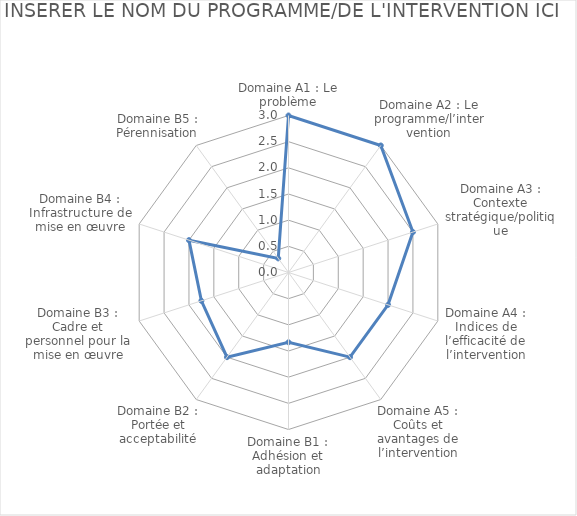
| Category | Note |
|---|---|
| Domaine A1 : Le problème | 3 |
| Domaine A2 : Le programme/l’intervention | 3 |
| Domaine A3 : Contexte stratégique/politique | 2.5 |
| Domaine A4 : Indices de l’efficacité de l’intervention | 2 |
| Domaine A5 : Coûts et avantages de l’intervention | 2 |
| Domaine B1 : Adhésion et adaptation | 1.333 |
| Domaine B2 : Portée et acceptabilité | 2 |
| Domaine B3 : Cadre et personnel pour la mise en œuvre | 1.75 |
| Domaine B4 : Infrastructure de mise en œuvre | 2 |
| Domaine B5 : Pérennisation | 0.333 |